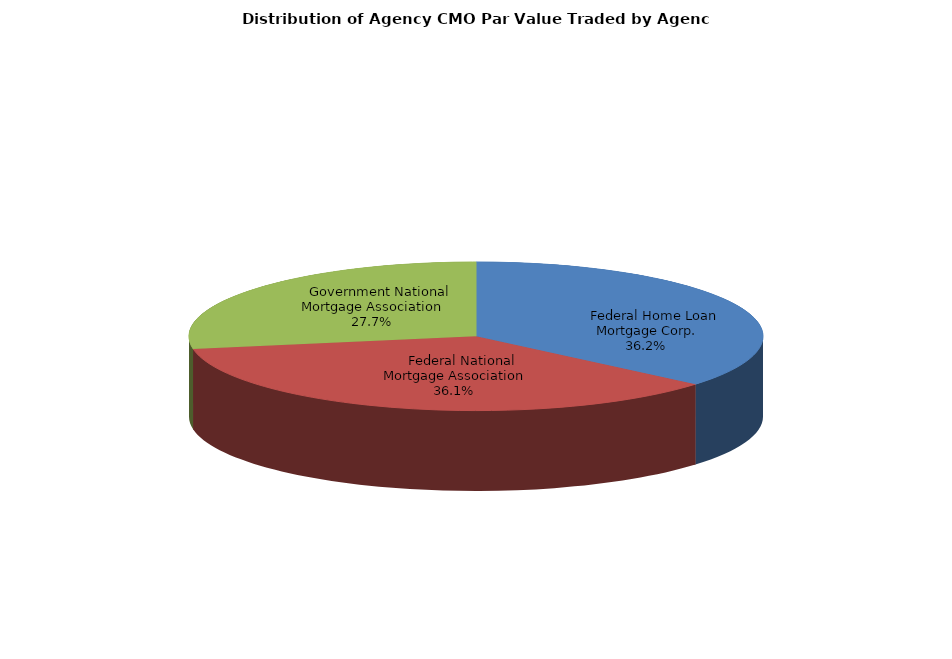
| Category | Series 0 |
|---|---|
|     Federal Home Loan Mortgage Corp. | 2187979461.651 |
|     Federal National Mortgage Association | 2184960545.457 |
|     Government National Mortgage Association | 1679552262.591 |